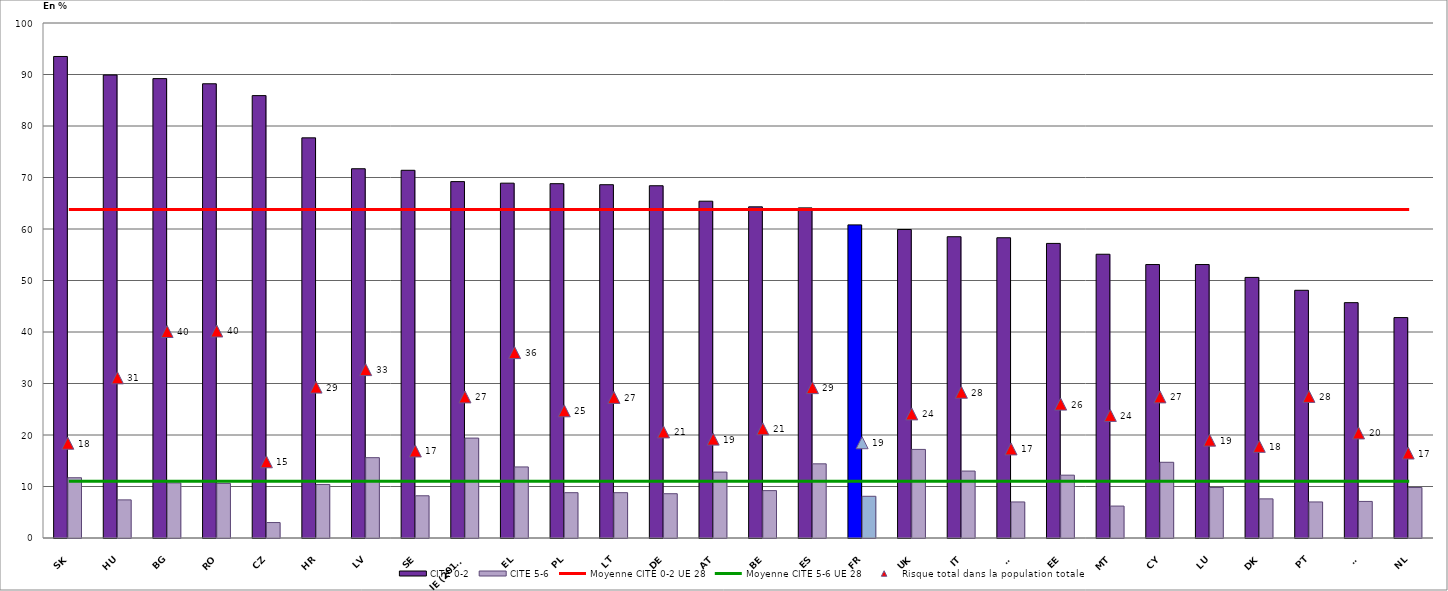
| Category | CITE 0-2 | CITE 5-6 |
|---|---|---|
| SK | 93.5 | 11.7 |
| HU | 89.9 | 7.4 |
| BG | 89.2 | 10.7 |
| RO | 88.2 | 10.6 |
| CZ | 85.9 | 3 |
| HR | 77.7 | 10.4 |
| LV | 71.7 | 15.6 |
| SE | 71.4 | 8.2 |
| IE (2013) | 69.2 | 19.4 |
| EL | 68.9 | 13.8 |
| PL | 68.8 | 8.8 |
| LT | 68.6 | 8.8 |
| DE | 68.4 | 8.6 |
| AT | 65.4 | 12.8 |
| BE | 64.3 | 9.2 |
| ES | 64.1 | 14.4 |
| FR | 60.8 | 8.1 |
| UK | 59.9 | 17.2 |
| IT | 58.5 | 13 |
| FI | 58.3 | 7 |
| EE | 57.2 | 12.2 |
| MT | 55.1 | 6.2 |
| CY | 53.1 | 14.7 |
| LU | 53.1 | 9.8 |
| DK | 50.6 | 7.6 |
| PT | 48.1 | 7 |
| SI | 45.7 | 7.1 |
| NL | 42.8 | 9.8 |